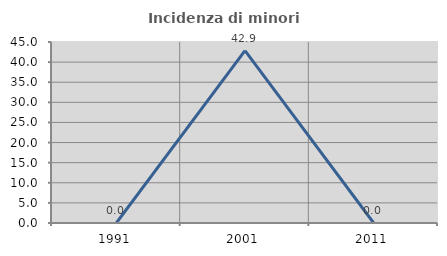
| Category | Incidenza di minori stranieri |
|---|---|
| 1991.0 | 0 |
| 2001.0 | 42.857 |
| 2011.0 | 0 |